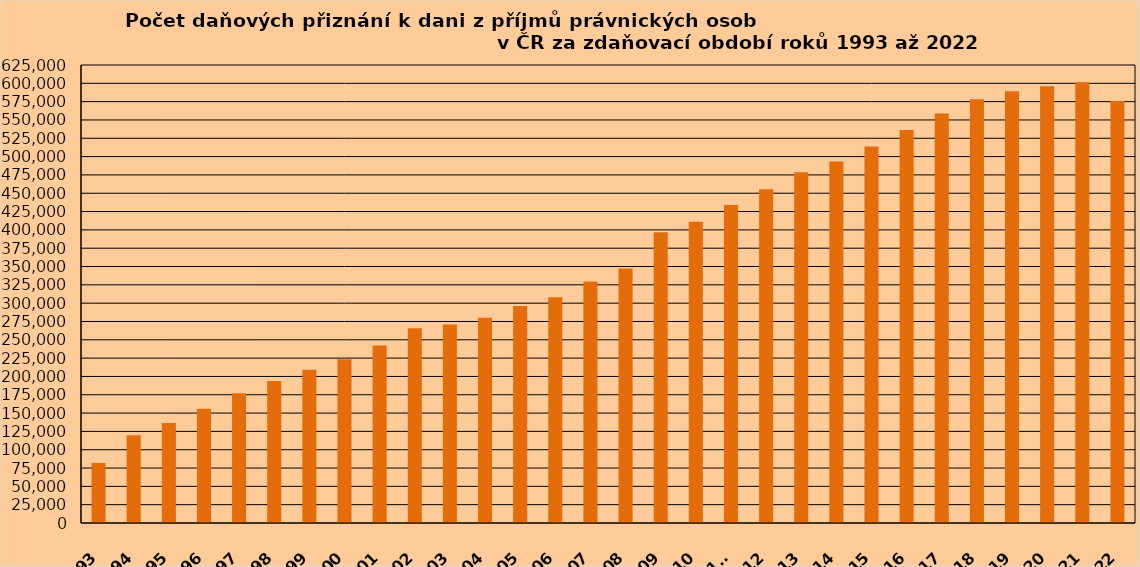
| Category | Series 1 |
|---|---|
| 1993 | 81950 |
| 1994 | 119831 |
| 1995 | 136334 |
| 1996 | 156029 |
| 1997 | 176934 |
| 1998 | 193797 |
| 1999 | 209106 |
| 2000 | 223307 |
| 2001 | 242164 |
| 2002 | 265813 |
| 2003 | 270968 |
| 2004 | 279964 |
| 2005 | 296271 |
| 2006 | 307986 |
| 2007 | 329481 |
| 2008 | 347457 |
| 2009 | 396925 |
| 2010 | 411060 |
| 2011* | 433818 |
| 2012 | 455482 |
| 2013 | 478527 |
| 2014 | 493300 |
| 2015 | 513784 |
| 2016 | 536430 |
| 2017 | 558797 |
| 2018 | 578346 |
| 2019 | 589271 |
| 2020 | 596094 |
| 2021 | 601305 |
| 2022 | 576002 |